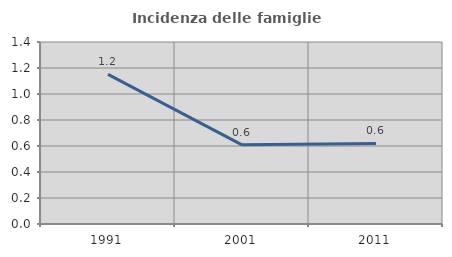
| Category | Incidenza delle famiglie numerose |
|---|---|
| 1991.0 | 1.15 |
| 2001.0 | 0.609 |
| 2011.0 | 0.62 |